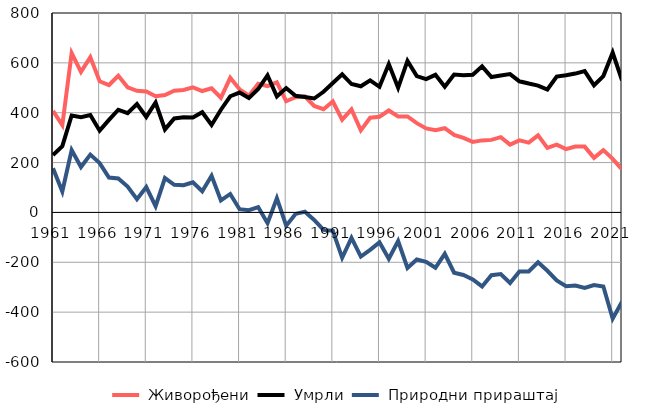
| Category |  Живорођени |  Умрли |  Природни прираштај |
|---|---|---|---|
| 1961.0 | 407 | 230 | 177 |
| 1962.0 | 350 | 266 | 84 |
| 1963.0 | 639 | 389 | 250 |
| 1964.0 | 564 | 382 | 182 |
| 1965.0 | 623 | 391 | 232 |
| 1966.0 | 526 | 328 | 198 |
| 1967.0 | 511 | 371 | 140 |
| 1968.0 | 548 | 412 | 136 |
| 1969.0 | 502 | 398 | 104 |
| 1970.0 | 488 | 435 | 53 |
| 1971.0 | 485 | 383 | 102 |
| 1972.0 | 466 | 441 | 25 |
| 1973.0 | 471 | 333 | 138 |
| 1974.0 | 488 | 377 | 111 |
| 1975.0 | 491 | 382 | 109 |
| 1976.0 | 502 | 381 | 121 |
| 1977.0 | 487 | 402 | 85 |
| 1978.0 | 498 | 351 | 147 |
| 1979.0 | 460 | 412 | 48 |
| 1980.0 | 540 | 466 | 74 |
| 1981.0 | 494 | 481 | 13 |
| 1982.0 | 468 | 459 | 9 |
| 1983.0 | 516 | 495 | 21 |
| 1984.0 | 507 | 550 | -43 |
| 1985.0 | 522 | 465 | 57 |
| 1986.0 | 446 | 499 | -53 |
| 1987.0 | 462 | 468 | -6 |
| 1988.0 | 466 | 463 | 3 |
| 1989.0 | 427 | 457 | -30 |
| 1990.0 | 414 | 484 | -70 |
| 1991.0 | 445 | 519 | -74 |
| 1992.0 | 372 | 554 | -182 |
| 1993.0 | 413 | 515 | -102 |
| 1994.0 | 329 | 506 | -177 |
| 1995.0 | 380 | 530 | -150 |
| 1996.0 | 384 | 504 | -120 |
| 1997.0 | 409 | 595 | -186 |
| 1998.0 | 385 | 500 | -115 |
| 1999.0 | 385 | 608 | -223 |
| 2000.0 | 358 | 547 | -189 |
| 2001.0 | 337 | 535 | -198 |
| 2002.0 | 330 | 552 | -222 |
| 2003.0 | 338 | 504 | -166 |
| 2004.0 | 311 | 553 | -242 |
| 2005.0 | 299 | 550 | -251 |
| 2006.0 | 283 | 552 | -269 |
| 2007.0 | 289 | 586 | -297 |
| 2008.0 | 291 | 543 | -252 |
| 2009.0 | 302 | 549 | -247 |
| 2010.0 | 272 | 555 | -283 |
| 2011.0 | 289 | 526 | -237 |
| 2012.0 | 280 | 517 | -237 |
| 2013.0 | 309 | 509 | -200 |
| 2014.0 | 259 | 493 | -234 |
| 2015.0 | 272 | 545 | -273 |
| 2016.0 | 254 | 550 | -296 |
| 2017.0 | 264 | 557 | -293 |
| 2018.0 | 264 | 567 | -303 |
| 2019.0 | 219 | 510 | -291 |
| 2020.0 | 250 | 547 | -297 |
| 2021.0 | 215 | 641 | -426 |
| 2022.0 | 172 | 530 | -358 |